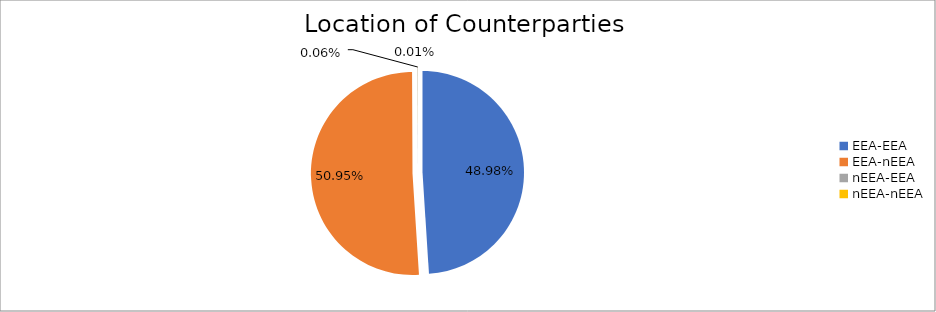
| Category | Series 0 |
|---|---|
| EEA-EEA | 6151755.262 |
| EEA-nEEA | 6398520.453 |
| nEEA-EEA | 7459.671 |
| nEEA-nEEA | 1242.22 |